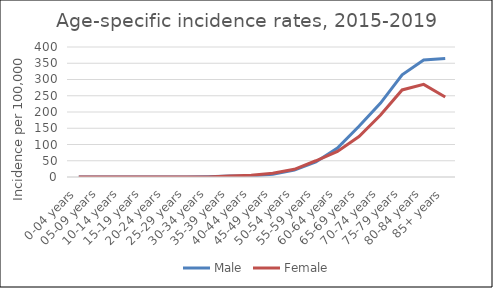
| Category | Male | Female |
|---|---|---|
| 0-04 years | 0 | 0 |
| 05-09 years | 0 | 0 |
| 10-14 years | 0 | 0 |
| 15-19 years | 0 | 0 |
| 20-24 years | 0 | 0 |
| 25-29 years | 0 | 0 |
| 30-34 years | 1.11 | 0 |
| 35-39 years | 2.72 | 3.05 |
| 40-44 years | 3.36 | 5.66 |
| 45-49 years | 8.35 | 11.36 |
| 50-54 years | 21.07 | 23.74 |
| 55-59 years | 46.44 | 49.98 |
| 60-64 years | 89.04 | 78.73 |
| 65-69 years | 156.09 | 124.49 |
| 70-74 years | 227.29 | 190.47 |
| 75-79 years | 314.26 | 267.91 |
| 80-84 years | 360.13 | 285.12 |
| 85+ years | 364.64 | 246.02 |